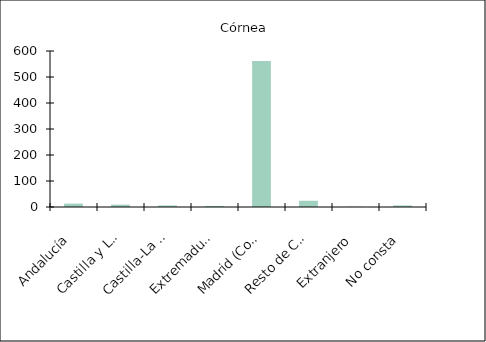
| Category | Córnea |
|---|---|
|    Andalucía | 13 |
|    Castilla y León | 9 |
|    Castilla-La Mancha | 6 |
|    Extremadura | 4 |
|    Madrid (Comunidad de) | 562 |
|    Resto de CCAA | 24 |
|    Extranjero | 1 |
|    No consta | 6 |